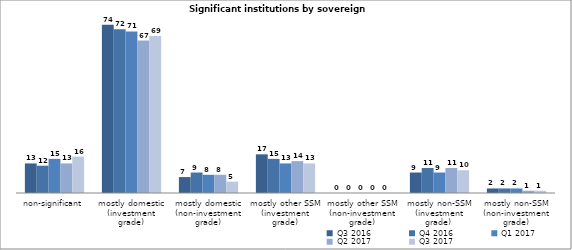
| Category | Q3 2016 | Q4 2016 | Q1 2017 | Q2 2017 | Q3 2017 |
|---|---|---|---|---|---|
| non-significant | 13 | 12 | 15 | 13 | 16 |
| mostly domestic
(investment grade) | 74 | 72 | 71 | 67 | 69 |
| mostly domestic
(non-investment grade) | 7 | 9 | 8 | 8 | 5 |
| mostly other SSM
(investment grade) | 17 | 15 | 13 | 14 | 13 |
| mostly other SSM
(non-investment grade) | 0 | 0 | 0 | 0 | 0 |
| mostly non-SSM
(investment grade)  | 9 | 11 | 9 | 11 | 10 |
| mostly non-SSM
(non-investment grade) | 2 | 2 | 2 | 1 | 1 |